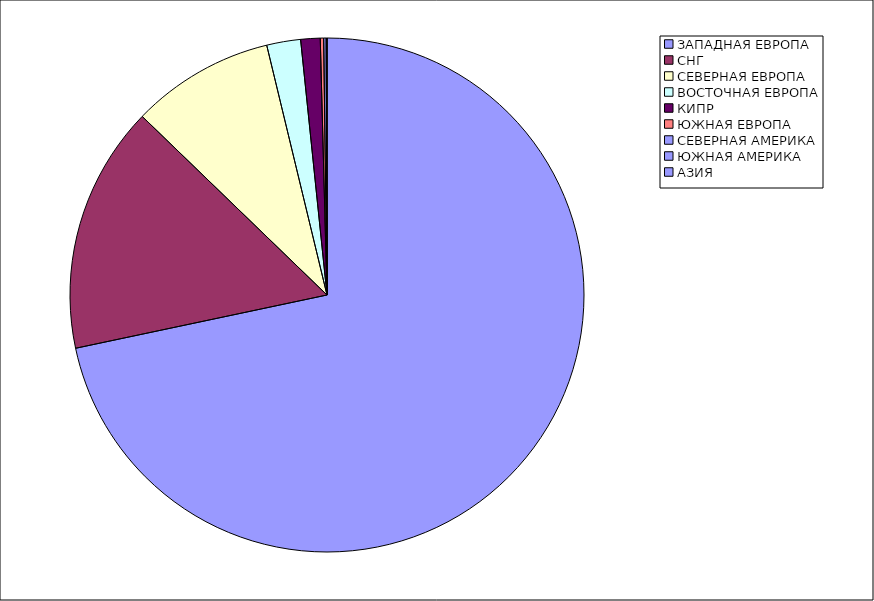
| Category | Оборот |
|---|---|
| ЗАПАДНАЯ ЕВРОПА | 0.717 |
| СНГ | 0.156 |
| СЕВЕРНАЯ ЕВРОПА | 0.09 |
| ВОСТОЧНАЯ ЕВРОПА | 0.021 |
| КИПР | 0.012 |
| ЮЖНАЯ ЕВРОПА | 0.002 |
| СЕВЕРНАЯ АМЕРИКА | 0.002 |
| ЮЖНАЯ АМЕРИКА | 0 |
| АЗИЯ | 0 |